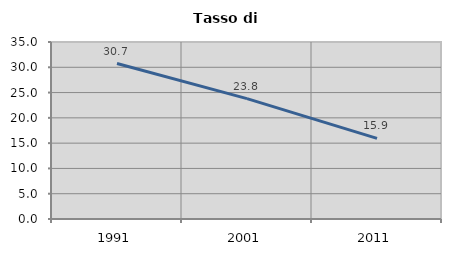
| Category | Tasso di disoccupazione   |
|---|---|
| 1991.0 | 30.736 |
| 2001.0 | 23.804 |
| 2011.0 | 15.944 |